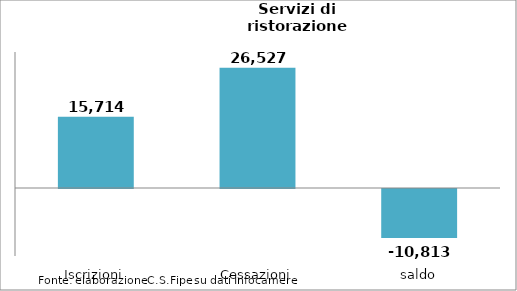
| Category | Series 0 |
|---|---|
| Iscrizioni | 15714 |
| Cessazioni | 26527 |
| saldo | -10813 |